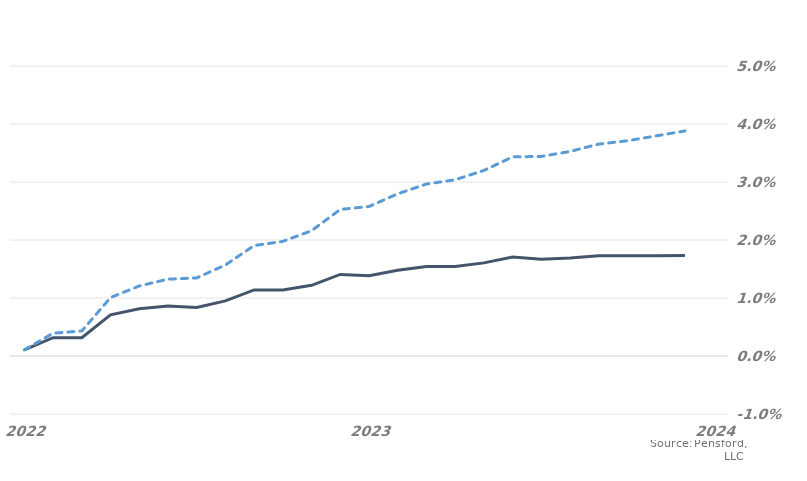
| Category | MARKET EXPECTATIONS | +1 Standard Deviation |
|---|---|---|
| 2022-01-31 | 0.001 | 0.001 |
| 2022-02-28 | 0.003 | 0.004 |
| 2022-03-28 | 0.003 | 0.004 |
| 2022-04-28 | 0.007 | 0.01 |
| 2022-05-28 | 0.008 | 0.012 |
| 2022-06-28 | 0.009 | 0.013 |
| 2022-07-28 | 0.008 | 0.013 |
| 2022-08-28 | 0.009 | 0.016 |
| 2022-09-28 | 0.011 | 0.019 |
| 2022-10-28 | 0.011 | 0.02 |
| 2022-11-28 | 0.012 | 0.022 |
| 2022-12-28 | 0.014 | 0.025 |
| 2023-01-28 | 0.014 | 0.026 |
| 2023-02-28 | 0.015 | 0.028 |
| 2023-03-28 | 0.015 | 0.03 |
| 2023-04-28 | 0.015 | 0.03 |
| 2023-05-28 | 0.016 | 0.032 |
| 2023-06-28 | 0.017 | 0.034 |
| 2023-07-28 | 0.017 | 0.034 |
| 2023-08-28 | 0.017 | 0.035 |
| 2023-09-28 | 0.017 | 0.037 |
| 2023-10-28 | 0.017 | 0.037 |
| 2023-11-28 | 0.017 | 0.038 |
| 2023-12-28 | 0.017 | 0.039 |
| 2024-01-28 | 0.018 | 0.041 |
| 2024-02-28 | 0.018 | 0.041 |
| 2024-03-28 | 0.018 | 0.042 |
| 2024-04-28 | 0.018 | 0.042 |
| 2024-05-28 | 0.018 | 0.043 |
| 2024-06-28 | 0.018 | 0.043 |
| 2024-07-28 | 0.018 | 0.043 |
| 2024-08-28 | 0.018 | 0.044 |
| 2024-09-28 | 0.018 | 0.044 |
| 2024-10-28 | 0.018 | 0.045 |
| 2024-11-28 | 0.018 | 0.045 |
| 2024-12-28 | 0.018 | 0.046 |
| 2025-01-28 | 0.018 | 0.045 |
| 2025-02-28 | 0.018 | 0.046 |
| 2025-03-28 | 0.018 | 0.046 |
| 2025-04-28 | 0.018 | 0.046 |
| 2025-05-28 | 0.018 | 0.047 |
| 2025-06-28 | 0.018 | 0.047 |
| 2025-07-28 | 0.018 | 0.047 |
| 2025-08-28 | 0.018 | 0.048 |
| 2025-09-28 | 0.018 | 0.048 |
| 2025-10-28 | 0.018 | 0.049 |
| 2025-11-28 | 0.018 | 0.048 |
| 2025-12-28 | 0.018 | 0.048 |
| 2026-01-28 | 0.018 | 0.048 |
| 2026-02-28 | 0.018 | 0.049 |
| 2026-03-28 | 0.018 | 0.049 |
| 2026-04-28 | 0.018 | 0.049 |
| 2026-05-28 | 0.018 | 0.049 |
| 2026-06-28 | 0.018 | 0.05 |
| 2026-07-28 | 0.018 | 0.05 |
| 2026-08-28 | 0.018 | 0.05 |
| 2026-09-28 | 0.018 | 0.051 |
| 2026-10-28 | 0.018 | 0.051 |
| 2026-11-28 | 0.018 | 0.051 |
| 2026-12-28 | 0.018 | 0.052 |
| 2027-01-28 | 0.018 | 0.053 |
| 2027-02-28 | 0.018 | 0.054 |
| 2027-03-28 | 0.018 | 0.054 |
| 2027-04-28 | 0.018 | 0.054 |
| 2027-05-28 | 0.018 | 0.055 |
| 2027-06-28 | 0.018 | 0.055 |
| 2027-07-28 | 0.018 | 0.055 |
| 2027-08-28 | 0.018 | 0.055 |
| 2027-09-28 | 0.018 | 0.056 |
| 2027-10-28 | 0.018 | 0.056 |
| 2027-11-28 | 0.018 | 0.056 |
| 2027-12-28 | 0.018 | 0.055 |
| 2028-01-28 | 0.018 | 0.055 |
| 2028-02-28 | 0.018 | 0.056 |
| 2028-03-28 | 0.018 | 0.056 |
| 2028-04-28 | 0.018 | 0.056 |
| 2028-05-28 | 0.018 | 0.056 |
| 2028-06-28 | 0.018 | 0.057 |
| 2028-07-28 | 0.018 | 0.057 |
| 2028-08-28 | 0.018 | 0.057 |
| 2028-09-28 | 0.018 | 0.057 |
| 2028-10-28 | 0.018 | 0.058 |
| 2028-11-28 | 0.018 | 0.058 |
| 2028-12-28 | 0.018 | 0.058 |
| 2029-01-28 | 0.018 | 0.058 |
| 2029-02-28 | 0.018 | 0.058 |
| 2029-03-28 | 0.018 | 0.059 |
| 2029-04-28 | 0.018 | 0.059 |
| 2029-05-28 | 0.018 | 0.059 |
| 2029-06-28 | 0.018 | 0.059 |
| 2029-07-28 | 0.018 | 0.06 |
| 2029-08-28 | 0.018 | 0.06 |
| 2029-09-28 | 0.018 | 0.06 |
| 2029-10-28 | 0.018 | 0.06 |
| 2029-11-28 | 0.018 | 0.06 |
| 2029-12-28 | 0.018 | 0.06 |
| 2030-01-28 | 0.018 | 0.06 |
| 2030-02-28 | 0.018 | 0.06 |
| 2030-03-28 | 0.018 | 0.06 |
| 2030-04-28 | 0.018 | 0.06 |
| 2030-05-28 | 0.018 | 0.061 |
| 2030-06-28 | 0.018 | 0.061 |
| 2030-07-28 | 0.018 | 0.061 |
| 2030-08-28 | 0.018 | 0.061 |
| 2030-09-28 | 0.018 | 0.061 |
| 2030-10-28 | 0.018 | 0.062 |
| 2030-11-28 | 0.018 | 0.062 |
| 2030-12-28 | 0.018 | 0.062 |
| 2031-01-28 | 0.019 | 0.063 |
| 2031-02-28 | 0.019 | 0.063 |
| 2031-03-28 | 0.019 | 0.063 |
| 2031-04-28 | 0.019 | 0.063 |
| 2031-05-28 | 0.019 | 0.064 |
| 2031-06-28 | 0.019 | 0.064 |
| 2031-07-28 | 0.019 | 0.064 |
| 2031-08-28 | 0.019 | 0.064 |
| 2031-09-28 | 0.019 | 0.064 |
| 2031-10-28 | 0.019 | 0.064 |
| 2031-11-28 | 0.019 | 0.064 |
| 2031-12-28 | 0.019 | 0.064 |